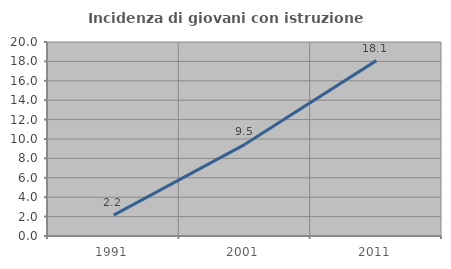
| Category | Incidenza di giovani con istruzione universitaria |
|---|---|
| 1991.0 | 2.158 |
| 2001.0 | 9.451 |
| 2011.0 | 18.081 |